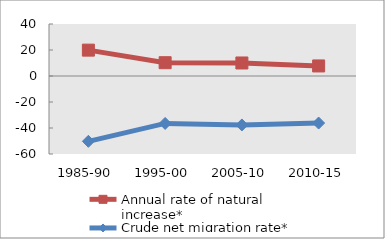
| Category | Annual rate of natural increase* | Crude net migration rate* |
|---|---|---|
| 1985-90 | 19.893 | -50.248 |
| 1995-00 | 10.229 | -36.489 |
| 2005-10 | 10.019 | -37.666 |
| 2010-15 | 7.735 | -36.191 |